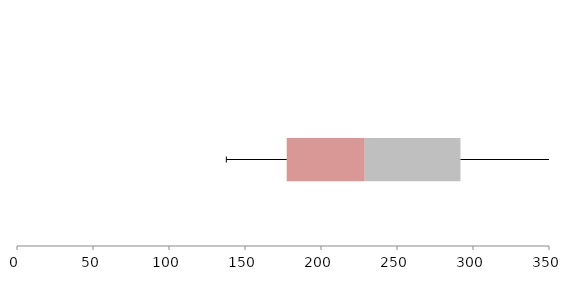
| Category | Series 1 | Series 2 | Series 3 |
|---|---|---|---|
| 0 | 177.438 | 51.338 | 62.981 |